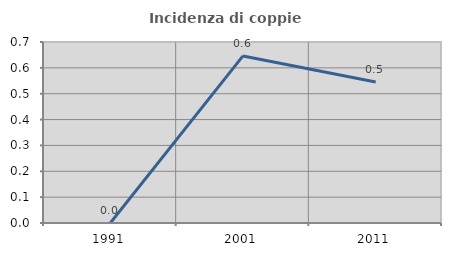
| Category | Incidenza di coppie miste |
|---|---|
| 1991.0 | 0 |
| 2001.0 | 0.646 |
| 2011.0 | 0.545 |